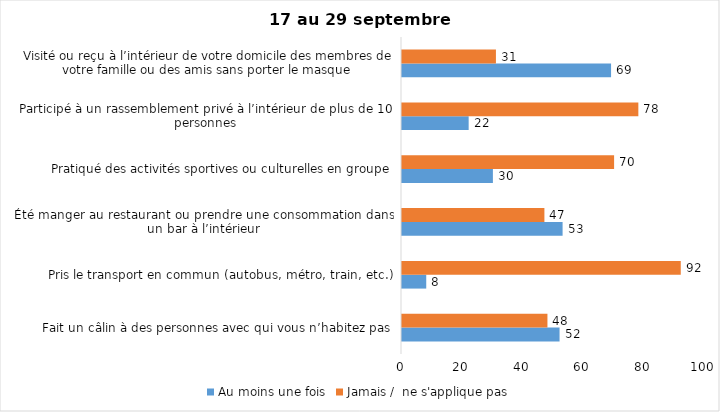
| Category | Au moins une fois | Jamais /  ne s'applique pas |
|---|---|---|
| Fait un câlin à des personnes avec qui vous n’habitez pas | 52 | 48 |
| Pris le transport en commun (autobus, métro, train, etc.) | 8 | 92 |
| Été manger au restaurant ou prendre une consommation dans un bar à l’intérieur | 53 | 47 |
| Pratiqué des activités sportives ou culturelles en groupe | 30 | 70 |
| Participé à un rassemblement privé à l’intérieur de plus de 10 personnes | 22 | 78 |
| Visité ou reçu à l’intérieur de votre domicile des membres de votre famille ou des amis sans porter le masque | 69 | 31 |